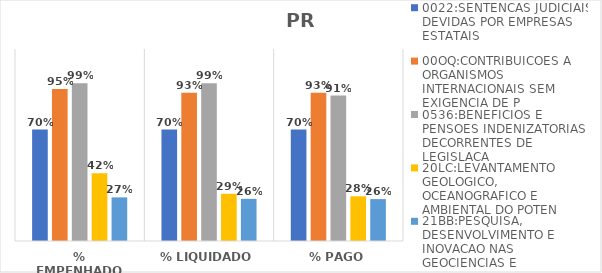
| Category | 0022:SENTENCAS JUDICIAIS DEVIDAS POR EMPRESAS ESTATAIS | 00OQ:CONTRIBUICOES A ORGANISMOS INTERNACIONAIS SEM EXIGENCIA DE P | 0536:BENEFICIOS E PENSOES INDENIZATORIAS DECORRENTES DE LEGISLACA | 20LC:LEVANTAMENTO GEOLOGICO, OCEANOGRAFICO E AMBIENTAL DO POTEN | 21BB:PESQUISA, DESENVOLVIMENTO E INOVACAO NAS GEOCIENCIAS E |
|---|---|---|---|---|---|
| % EMPENHADO | 0.697 | 0.95 | 0.985 | 0.424 | 0.273 |
| % LIQUIDADO | 0.697 | 0.926 | 0.985 | 0.295 | 0.263 |
| % PAGO | 0.697 | 0.926 | 0.909 | 0.279 | 0.262 |